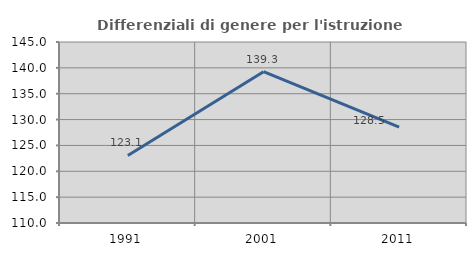
| Category | Differenziali di genere per l'istruzione superiore |
|---|---|
| 1991.0 | 123.064 |
| 2001.0 | 139.254 |
| 2011.0 | 128.525 |